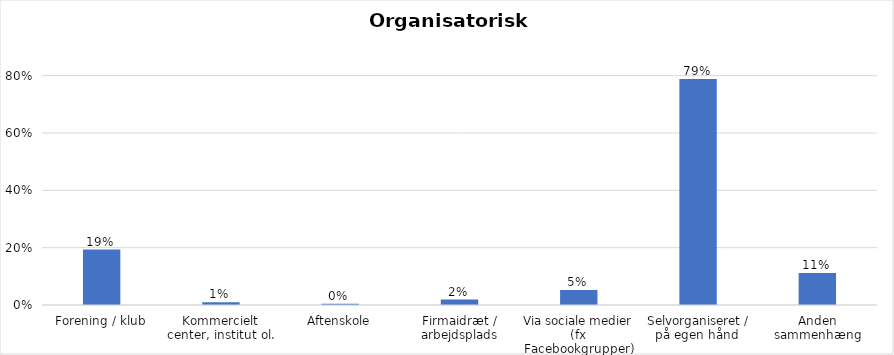
| Category | % |
|---|---|
| Forening / klub | 0.193 |
| Kommercielt center, institut ol. | 0.01 |
| Aftenskole | 0.004 |
| Firmaidræt / arbejdsplads | 0.019 |
| Via sociale medier (fx Facebookgrupper) | 0.052 |
| Selvorganiseret / på egen hånd  | 0.789 |
| Anden sammenhæng | 0.111 |